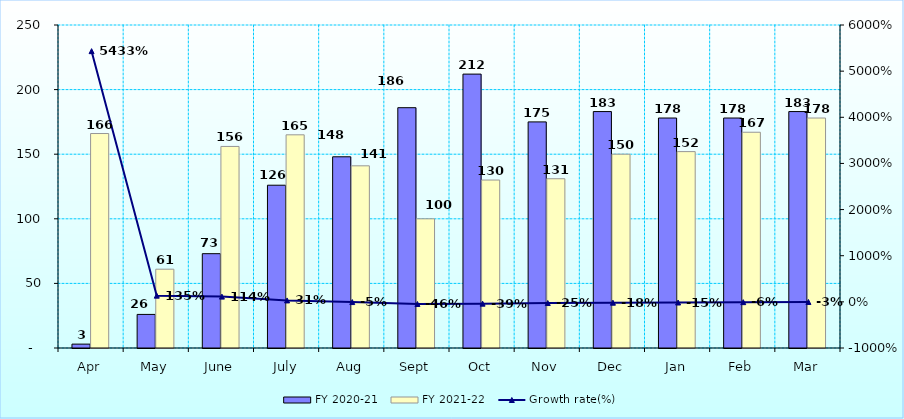
| Category | FY 2020-21 | FY 2021-22 |
|---|---|---|
| Apr | 3 | 166 |
| May | 26 | 61 |
| June | 73 | 156 |
| July | 126 | 165 |
| Aug | 148 | 141 |
| Sept | 186 | 100 |
| Oct | 212 | 130 |
| Nov | 175 | 131 |
| Dec | 183 | 150 |
| Jan | 178 | 152 |
| Feb | 178 | 167 |
| Mar | 183 | 178 |